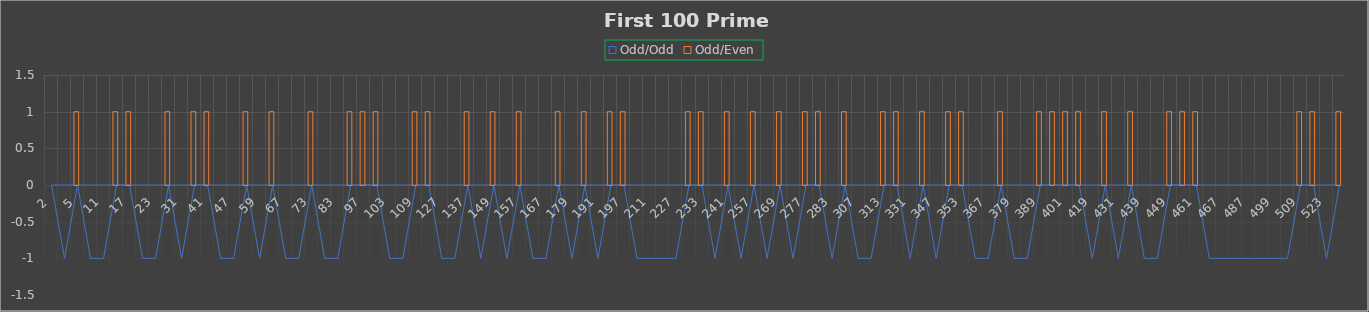
| Category | Odd/Even |
|---|---|
| 2.0 | 0 |
| 3.0 | 0 |
| 5.0 | 1 |
| 7.0 | 0 |
| 11.0 | 0 |
| 13.0 | 1 |
| 17.0 | 1 |
| 19.0 | 0 |
| 23.0 | 0 |
| 29.0 | 1 |
| 31.0 | 0 |
| 37.0 | 1 |
| 41.0 | 1 |
| 43.0 | 0 |
| 47.0 | 0 |
| 53.0 | 1 |
| 59.0 | 0 |
| 61.0 | 1 |
| 67.0 | 0 |
| 71.0 | 0 |
| 73.0 | 1 |
| 79.0 | 0 |
| 83.0 | 0 |
| 89.0 | 1 |
| 97.0 | 1 |
| 101.0 | 1 |
| 103.0 | 0 |
| 107.0 | 0 |
| 109.0 | 1 |
| 113.0 | 1 |
| 127.0 | 0 |
| 131.0 | 0 |
| 137.0 | 1 |
| 139.0 | 0 |
| 149.0 | 1 |
| 151.0 | 0 |
| 157.0 | 1 |
| 163.0 | 0 |
| 167.0 | 0 |
| 173.0 | 1 |
| 179.0 | 0 |
| 181.0 | 1 |
| 191.0 | 0 |
| 193.0 | 1 |
| 197.0 | 1 |
| 199.0 | 0 |
| 211.0 | 0 |
| 223.0 | 0 |
| 227.0 | 0 |
| 229.0 | 1 |
| 233.0 | 1 |
| 239.0 | 0 |
| 241.0 | 1 |
| 251.0 | 0 |
| 257.0 | 1 |
| 263.0 | 0 |
| 269.0 | 1 |
| 271.0 | 0 |
| 277.0 | 1 |
| 281.0 | 1 |
| 283.0 | 0 |
| 293.0 | 1 |
| 307.0 | 0 |
| 311.0 | 0 |
| 313.0 | 1 |
| 317.0 | 1 |
| 331.0 | 0 |
| 337.0 | 1 |
| 347.0 | 0 |
| 349.0 | 1 |
| 353.0 | 1 |
| 359.0 | 0 |
| 367.0 | 0 |
| 373.0 | 1 |
| 379.0 | 0 |
| 383.0 | 0 |
| 389.0 | 1 |
| 397.0 | 1 |
| 401.0 | 1 |
| 409.0 | 1 |
| 419.0 | 0 |
| 421.0 | 1 |
| 431.0 | 0 |
| 433.0 | 1 |
| 439.0 | 0 |
| 443.0 | 0 |
| 449.0 | 1 |
| 457.0 | 1 |
| 461.0 | 1 |
| 463.0 | 0 |
| 467.0 | 0 |
| 479.0 | 0 |
| 487.0 | 0 |
| 491.0 | 0 |
| 499.0 | 0 |
| 503.0 | 0 |
| 509.0 | 1 |
| 521.0 | 1 |
| 523.0 | 0 |
| 541.0 | 1 |